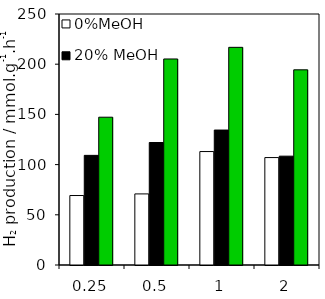
| Category | 0%MeOH | 20% MeOH | 100% MeOH |
|---|---|---|---|
| 0.25 | 69.2 | 109.2 | 147.2 |
| 0.5 | 70.8 | 122 | 205.2 |
| 1.0 | 113 | 134.4 | 216.8 |
| 2.0 | 107 | 108.4 | 194.4 |